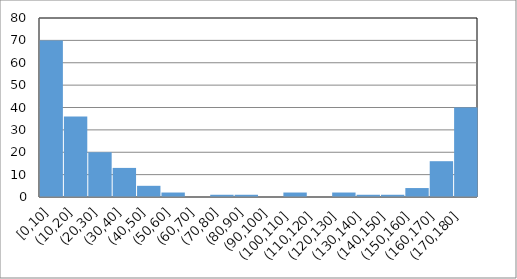
| Category | Counts |
|---|---|
| [-80,-70] | 2 |
| [-70,-60] | 0 |
| [-60,-50] | 2 |
| [-50,-40] | 1 |
| [-40,-30] | 1 |
| [-30,-20] | 4 |
| [-20,-10] | 16 |
| [-10,0] | 40 |
| [0,10] | 70 |
| [10,20] | 36 |
| [20,30] | 20 |
| [30,40] | 13 |
| [40,50] | 5 |
| [50,60] | 2 |
| [60,70] | 0 |
| [70,80] | 1 |
| [80,90] | 1 |